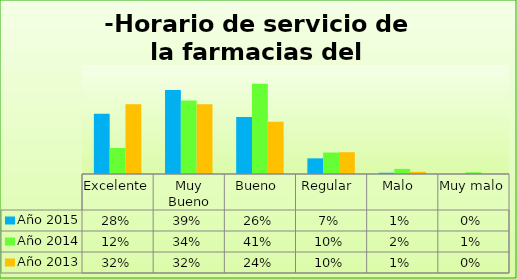
| Category | Año 2015 | Año 2014 | Año 2013 |
|---|---|---|---|
| Excelente | 0.276 | 0.119 | 0.32 |
| Muy Bueno | 0.385 | 0.337 | 0.32 |
| Bueno  | 0.261 | 0.415 | 0.24 |
| Regular  | 0.072 | 0.098 | 0.1 |
| Malo  | 0.006 | 0.023 | 0.01 |
| Muy malo  | 0 | 0.008 | 0 |